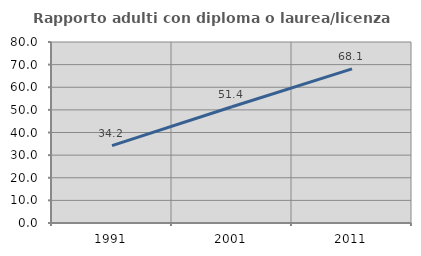
| Category | Rapporto adulti con diploma o laurea/licenza media  |
|---|---|
| 1991.0 | 34.222 |
| 2001.0 | 51.388 |
| 2011.0 | 68.122 |